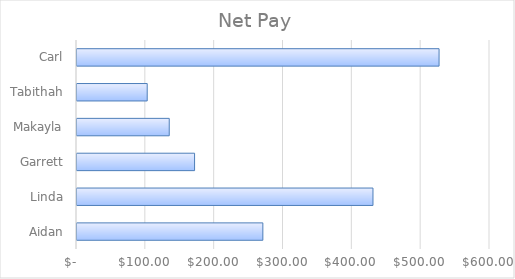
| Category | Series 0 |
|---|---|
| Aidan | 270 |
| Linda | 430 |
| Garrett | 170.8 |
| Makayla | 134 |
| Tabithah | 102 |
| Carl | 526 |